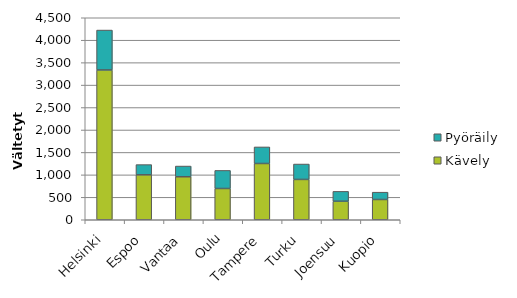
| Category | Kävely | Pyöräily |
|---|---|---|
| Helsinki | 3336.915 | 888.956 |
| Espoo | 1001.167 | 227.775 |
| Vantaa | 957.933 | 238.735 |
| Oulu | 696.287 | 402.815 |
| Tampere | 1253.425 | 368.977 |
| Turku | 898.146 | 343.383 |
| Joensuu | 412.386 | 219.862 |
| Kuopio | 451.444 | 163.251 |